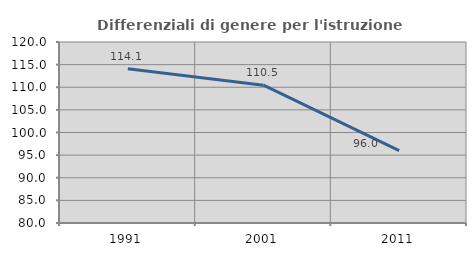
| Category | Differenziali di genere per l'istruzione superiore |
|---|---|
| 1991.0 | 114.091 |
| 2001.0 | 110.461 |
| 2011.0 | 96.014 |